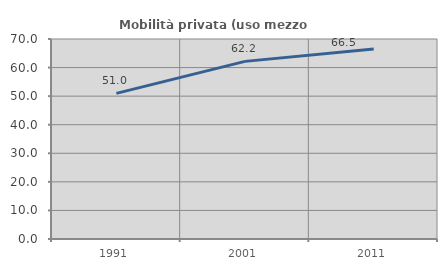
| Category | Mobilità privata (uso mezzo privato) |
|---|---|
| 1991.0 | 50.955 |
| 2001.0 | 62.171 |
| 2011.0 | 66.479 |